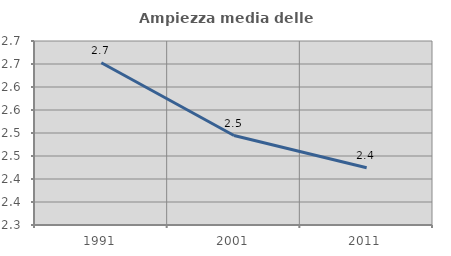
| Category | Ampiezza media delle famiglie |
|---|---|
| 1991.0 | 2.653 |
| 2001.0 | 2.495 |
| 2011.0 | 2.424 |